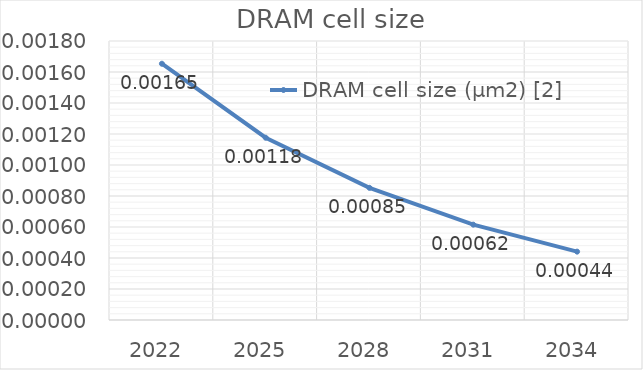
| Category | DRAM cell size (µm2) [2] |
|---|---|
| 2022.0 | 0.002 |
| 2025.0 | 0.001 |
| 2028.0 | 0.001 |
| 2031.0 | 0.001 |
| 2034.0 | 0 |